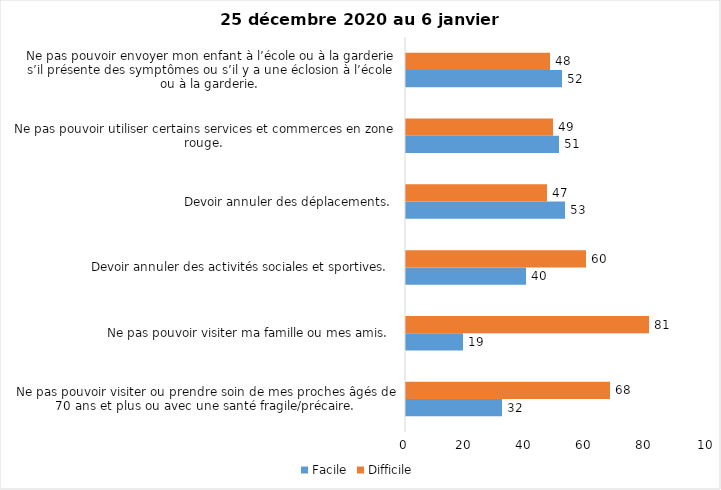
| Category | Facile | Difficile |
|---|---|---|
| Ne pas pouvoir visiter ou prendre soin de mes proches âgés de 70 ans et plus ou avec une santé fragile/précaire.  | 32 | 68 |
| Ne pas pouvoir visiter ma famille ou mes amis.  | 19 | 81 |
| Devoir annuler des activités sociales et sportives.  | 40 | 60 |
| Devoir annuler des déplacements.  | 53 | 47 |
| Ne pas pouvoir utiliser certains services et commerces en zone rouge.  | 51 | 49 |
| Ne pas pouvoir envoyer mon enfant à l’école ou à la garderie s’il présente des symptômes ou s’il y a une éclosion à l’école ou à la garderie.  | 52 | 48 |